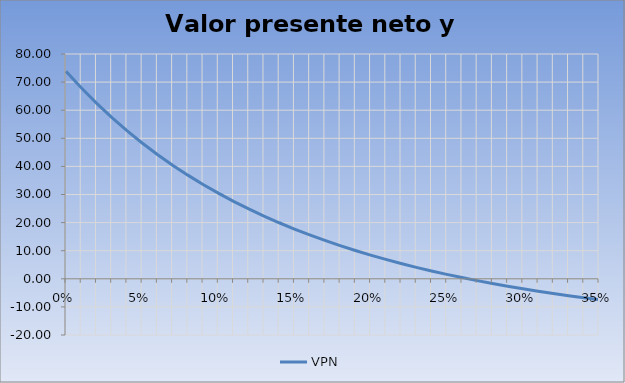
| Category | VPN |
|---|---|
| 0.0 | 73.836 |
| 0.01 | 67.958 |
| 0.02 | 62.503 |
| 0.03 | 57.435 |
| 0.04 | 52.722 |
| 0.05 | 48.336 |
| 0.06 | 44.251 |
| 0.07 | 40.443 |
| 0.08 | 36.89 |
| 0.09 | 33.573 |
| 0.1 | 30.473 |
| 0.11 | 27.575 |
| 0.12 | 24.863 |
| 0.13 | 22.323 |
| 0.14 | 19.943 |
| 0.15 | 17.711 |
| 0.16 | 15.617 |
| 0.17 | 13.651 |
| 0.18 | 11.803 |
| 0.19 | 10.066 |
| 0.2 | 8.432 |
| 0.21 | 6.894 |
| 0.22 | 5.445 |
| 0.23 | 4.08 |
| 0.24 | 2.792 |
| 0.25 | 1.578 |
| 0.26 | 0.432 |
| 0.27 | -0.651 |
| 0.28 | -1.674 |
| 0.29 | -2.641 |
| 0.3 | -3.555 |
| 0.31 | -4.421 |
| 0.32 | -5.24 |
| 0.33 | -6.016 |
| 0.34 | -6.751 |
| 0.35 | -7.448 |